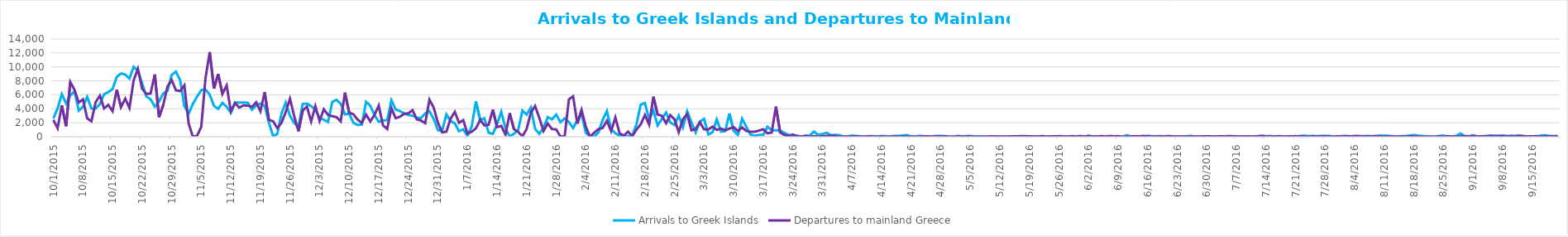
| Category | Arrivals to Greek Islands | Departures to mainland Greece |
|---|---|---|
| 10/1/15 | 2631 | 2409 |
| 10/2/15 | 4055 | 1215 |
| 10/3/15 | 6097 | 4480 |
| 10/4/15 | 4763 | 1513 |
| 10/5/15 | 5909 | 7833 |
| 10/6/15 | 6496 | 6707 |
| 10/7/15 | 3734 | 4886 |
| 10/8/15 | 4295 | 5349 |
| 10/9/15 | 5695 | 2631 |
| 10/10/15 | 4045 | 2214 |
| 10/11/15 | 4034 | 4950 |
| 10/12/15 | 4671 | 5879 |
| 10/13/15 | 6079 | 4052 |
| 10/14/15 | 6380 | 4564 |
| 10/15/15 | 6830 | 3660 |
| 10/16/15 | 8564 | 6743 |
| 10/17/15 | 9063 | 4239 |
| 10/18/15 | 8900 | 5457 |
| 10/19/15 | 8337 | 4119 |
| 10/20/15 | 10006 | 8083 |
| 10/21/15 | 9444 | 9725 |
| 10/22/15 | 7651 | 6896 |
| 10/23/15 | 5762 | 6120 |
| 10/24/15 | 5354 | 6195 |
| 10/25/15 | 4311 | 8916 |
| 10/26/15 | 5049 | 2804 |
| 10/27/15 | 6195 | 4540 |
| 10/28/15 | 6557 | 7191 |
| 10/29/15 | 8847 | 8117 |
| 10/30/15 | 9323 | 6649 |
| 10/31/15 | 8089 | 6537 |
| 11/1/15 | 4400 | 7360 |
| 11/2/15 | 3290 | 1935 |
| 11/3/15 | 4689 | 0 |
| 11/4/15 | 5740 | 142 |
| 11/5/15 | 6679 | 1430 |
| 11/6/15 | 6765 | 8392 |
| 11/7/15 | 6022 | 12116 |
| 11/8/15 | 4425 | 6902 |
| 11/9/15 | 3979 | 8977 |
| 11/10/15 | 4842 | 6133 |
| 11/11/15 | 4296 | 7354 |
| 11/12/15 | 3425 | 3650 |
| 11/13/15 | 4909 | 4820 |
| 11/14/15 | 4884 | 4171 |
| 11/15/15 | 4891 | 4497 |
| 11/16/15 | 4873 | 4442 |
| 11/17/15 | 3873 | 4289 |
| 11/18/15 | 4499 | 4927 |
| 11/19/15 | 4737 | 3644 |
| 11/20/15 | 4432 | 6389 |
| 11/21/15 | 2020 | 2401 |
| 11/22/15 | 76 | 2214 |
| 11/23/15 | 409 | 1245 |
| 11/24/15 | 3383 | 2006 |
| 11/25/15 | 4889 | 3565 |
| 11/26/15 | 2973 | 5435 |
| 11/27/15 | 1961 | 2932 |
| 11/28/15 | 1420 | 778 |
| 11/29/15 | 4703 | 3736 |
| 11/30/15 | 4744 | 4318 |
| 12/1/15 | 4386 | 2181 |
| 12/2/15 | 3863 | 4384 |
| 12/3/15 | 2671 | 2255 |
| 12/4/15 | 2435 | 3934 |
| 12/5/15 | 2110 | 3115 |
| 12/6/15 | 4978 | 2943 |
| 12/7/15 | 5287 | 2810 |
| 12/8/15 | 4721 | 2189 |
| 12/9/15 | 3203 | 6316 |
| 12/10/15 | 3308 | 3456 |
| 12/11/15 | 1999 | 3219 |
| 12/12/15 | 1671 | 2453 |
| 12/13/15 | 1738 | 1976 |
| 12/14/15 | 5005 | 3175 |
| 12/15/15 | 4421 | 2191 |
| 12/16/15 | 3105 | 3137 |
| 12/17/15 | 2135 | 4461 |
| 12/18/15 | 2330 | 1638 |
| 12/19/15 | 2373 | 1110 |
| 12/20/15 | 5223 | 4070 |
| 12/21/15 | 3904 | 2652 |
| 12/22/15 | 3668 | 2864 |
| 12/23/15 | 3354 | 3278 |
| 12/24/15 | 3110 | 3349 |
| 12/25/15 | 3008 | 3806 |
| 12/26/15 | 2710 | 2498 |
| 12/27/15 | 2678 | 2311 |
| 12/28/15 | 3337 | 1946 |
| 12/29/15 | 3643 | 5309 |
| 12/30/15 | 2552 | 4178 |
| 12/31/15 | 948 | 2009 |
| 1/1/16 | 828 | 623 |
| 1/2/16 | 3203 | 720 |
| 1/3/16 | 2241 | 2569 |
| 1/4/16 | 1917 | 3563 |
| 1/5/16 | 779 | 1998 |
| 1/6/16 | 1067 | 2377 |
| 1/7/16 | 119 | 463 |
| 1/8/16 | 1475 | 716 |
| 1/9/16 | 5050 | 1203 |
| 1/10/16 | 2410 | 2417 |
| 1/11/16 | 2645 | 1621 |
| 1/12/16 | 571 | 1701 |
| 1/13/16 | 408 | 3861 |
| 1/14/16 | 1792 | 1378 |
| 1/15/16 | 3564 | 1551 |
| 1/16/16 | 1188 | 301 |
| 1/17/16 | 39 | 3378 |
| 1/18/16 | 435 | 1078 |
| 1/19/16 | 964 | 695 |
| 1/20/16 | 3748 | 50 |
| 1/21/16 | 3166 | 1108 |
| 1/22/16 | 4176 | 3451 |
| 1/23/16 | 1124 | 4397 |
| 1/24/16 | 418 | 2706 |
| 1/25/16 | 1295 | 819 |
| 1/26/16 | 2808 | 1887 |
| 1/27/16 | 2488 | 1098 |
| 1/28/16 | 3180 | 1046 |
| 1/29/16 | 2076 | 40 |
| 1/30/16 | 2623 | 53 |
| 1/31/16 | 2105 | 5342 |
| 2/1/16 | 1244 | 5783 |
| 2/2/16 | 2368 | 1878 |
| 2/3/16 | 3299 | 3829 |
| 2/4/16 | 565 | 1436 |
| 2/5/16 | 38 | 0 |
| 2/6/16 | 7 | 578 |
| 2/7/16 | 608 | 1097 |
| 2/8/16 | 2418 | 1259 |
| 2/9/16 | 3676 | 2283 |
| 2/10/16 | 1071 | 793 |
| 2/11/16 | 502 | 2756 |
| 2/12/16 | 123 | 496 |
| 2/13/16 | 186 | 161 |
| 2/14/16 | 51 | 724 |
| 2/15/16 | 181 | 65 |
| 2/16/16 | 1783 | 1024 |
| 2/17/16 | 4611 | 1772 |
| 2/18/16 | 4824 | 3118 |
| 2/19/16 | 2440 | 1731 |
| 2/20/16 | 3772 | 5738 |
| 2/21/16 | 1618 | 3180 |
| 2/22/16 | 2545 | 3002 |
| 2/23/16 | 3474 | 1927 |
| 2/24/16 | 2044 | 3086 |
| 2/25/16 | 1675 | 2468 |
| 2/26/16 | 3021 | 649 |
| 2/27/16 | 1355 | 2525 |
| 2/28/16 | 3651 | 3234 |
| 2/29/16 | 2072 | 920 |
| 3/1/16 | 609 | 1107 |
| 3/2/16 | 2162 | 2073 |
| 3/3/16 | 2569 | 1061 |
| 3/4/16 | 332 | 1035 |
| 3/5/16 | 630 | 1444 |
| 3/6/16 | 2480 | 980 |
| 3/7/16 | 728 | 1171 |
| 3/8/16 | 811 | 922 |
| 3/9/16 | 3340 | 1169 |
| 3/10/16 | 835 | 1381 |
| 3/11/16 | 232 | 810 |
| 3/12/16 | 2578 | 1326 |
| 3/13/16 | 1418 | 831 |
| 3/14/16 | 301 | 693 |
| 3/15/16 | 128 | 721 |
| 3/16/16 | 252 | 882 |
| 3/17/16 | 263 | 1068 |
| 3/18/16 | 1431 | 489 |
| 3/19/16 | 926 | 608 |
| 3/20/16 | 931 | 4314 |
| 3/21/16 | 880 | 616 |
| 3/22/16 | 539 | 254 |
| 3/23/16 | 269 | 95 |
| 3/24/16 | 83 | 316 |
| 3/25/16 | 177 | 22 |
| 3/26/16 | 5 | 25 |
| 3/27/16 | 144 | 113 |
| 3/28/16 | 161 | 0 |
| 3/29/16 | 741 | 76 |
| 3/30/16 | 267 | 11 |
| 3/31/16 | 401 | 68 |
| 4/1/16 | 555 | 102 |
| 4/2/16 | 231 | 132 |
| 4/3/16 | 262 | 105 |
| 4/4/16 | 228 | 0 |
| 4/5/16 | 28 | 31 |
| 4/6/16 | 70 | 7 |
| 4/7/16 | 157 | 32 |
| 4/8/16 | 116 | 17 |
| 4/9/16 | 59 | 14 |
| 4/10/16 | 0 | 16 |
| 4/11/16 | 75 | 64 |
| 4/12/16 | 101 | 5 |
| 4/13/16 | 30 | 10 |
| 4/14/16 | 106 | 36 |
| 4/15/16 | 79 | 0 |
| 4/16/16 | 55 | 0 |
| 4/17/16 | 107 | 34 |
| 4/18/16 | 107 | 9 |
| 4/19/16 | 178 | 39 |
| 4/20/16 | 233 | 7 |
| 4/21/16 | 49 | 7 |
| 4/22/16 | 34 | 16 |
| 4/23/16 | 137 | 0 |
| 4/24/16 | 52 | 51 |
| 4/25/16 | 0 | 54 |
| 4/26/16 | 62 | 17 |
| 4/27/16 | 108 | 52 |
| 4/28/16 | 110 | 16 |
| 4/29/16 | 90 | 56 |
| 4/30/16 | 0 | 4 |
| 5/1/16 | 0 | 0 |
| 5/2/16 | 123 | 25 |
| 5/3/16 | 53 | 34 |
| 5/4/16 | 87 | 41 |
| 5/5/16 | 123 | 37 |
| 5/6/16 | 14 | 1 |
| 5/7/16 | 48 | 0 |
| 5/8/16 | 37 | 0 |
| 5/9/16 | 42 | 5 |
| 5/10/16 | 63 | 46 |
| 5/11/16 | 73 | 40 |
| 5/12/16 | 11 | 39 |
| 5/13/16 | 6 | 31 |
| 5/14/16 | 8 | 22 |
| 5/15/16 | 47 | 75 |
| 5/16/16 | 16 | 51 |
| 5/17/16 | 24 | 88 |
| 5/18/16 | 98 | 64 |
| 5/19/16 | 14 | 62 |
| 5/20/16 | 35 | 39 |
| 5/21/16 | 76 | 31 |
| 5/22/16 | 50 | 93 |
| 5/23/16 | 6 | 27 |
| 5/24/16 | 0 | 48 |
| 5/25/16 | 1 | 70 |
| 5/26/16 | 104 | 60 |
| 5/27/16 | 68 | 31 |
| 5/28/16 | 2 | 31 |
| 5/29/16 | 97 | 62 |
| 5/30/16 | 14 | 35 |
| 5/31/16 | 125 | 57 |
| 6/1/16 | 7 | 36 |
| 6/2/16 | 173 | 57 |
| 6/3/16 | 15 | 29 |
| 6/4/16 | 20 | 28 |
| 6/5/16 | 0 | 99 |
| 6/6/16 | 18 | 34 |
| 6/7/16 | 56 | 105 |
| 6/8/16 | 8 | 65 |
| 6/9/16 | 0 | 80 |
| 6/10/16 | 5 | 6 |
| 6/11/16 | 205 | 9 |
| 6/12/16 | 67 | 42 |
| 6/13/16 | 37 | 56 |
| 6/14/16 | 0 | 55 |
| 6/15/16 | 0 | 111 |
| 6/16/16 | 141 | 47 |
| 6/17/16 | 72 | 33 |
| 6/18/16 | 52 | 20 |
| 6/19/16 | 103 | 16 |
| 6/20/16 | 44 | 31 |
| 6/21/16 | 1 | 104 |
| 6/22/16 | 72 | 40 |
| 6/23/16 | 70 | 29 |
| 6/24/16 | 13 | 35 |
| 6/25/16 | 24 | 18 |
| 6/26/16 | 134 | 44 |
| 6/27/16 | 55 | 23 |
| 6/28/16 | 0 | 28 |
| 6/29/16 | 35 | 71 |
| 6/30/16 | 62 | 73 |
| 7/1/16 | 1 | 52 |
| 7/2/16 | 44 | 19 |
| 7/3/16 | 42 | 69 |
| 7/4/16 | 35 | 40 |
| 7/5/16 | 94 | 74 |
| 7/6/16 | 0 | 76 |
| 7/7/16 | 0 | 43 |
| 7/8/16 | 59 | 41 |
| 7/9/16 | 0 | 47 |
| 7/10/16 | 70 | 23 |
| 7/11/16 | 0 | 42 |
| 7/12/16 | 40 | 69 |
| 7/13/16 | 93 | 128 |
| 7/14/16 | 82 | 45 |
| 7/15/16 | 111 | 37 |
| 7/16/16 | 37 | 37 |
| 7/17/16 | 90 | 52 |
| 7/18/16 | 63 | 23 |
| 7/19/16 | 6 | 45 |
| 7/20/16 | 53 | 68 |
| 7/21/16 | 20 | 78 |
| 7/22/16 | 113 | 33 |
| 7/23/16 | 158 | 19 |
| 7/24/16 | 82 | 30 |
| 7/25/16 | 129 | 49 |
| 7/26/16 | 85 | 31 |
| 7/27/16 | 107 | 64 |
| 7/28/16 | 117 | 48 |
| 7/29/16 | 118 | 13 |
| 7/30/16 | 6 | 11 |
| 7/31/16 | 0 | 70 |
| 8/1/16 | 107 | 31 |
| 8/2/16 | 117 | 47 |
| 8/3/16 | 54 | 63 |
| 8/4/16 | 120 | 73 |
| 8/5/16 | 79 | 79 |
| 8/6/16 | 81 | 20 |
| 8/7/16 | 124 | 25 |
| 8/8/16 | 73 | 28 |
| 8/9/16 | 90 | 82 |
| 8/10/16 | 174 | 35 |
| 8/11/16 | 148 | 30 |
| 8/12/16 | 131 | 23 |
| 8/13/16 | 65 | 20 |
| 8/14/16 | 17 | 13 |
| 8/15/16 | 78 | 26 |
| 8/16/16 | 88 | 19 |
| 8/17/16 | 172 | 51 |
| 8/18/16 | 258 | 43 |
| 8/19/16 | 140 | 20 |
| 8/20/16 | 112 | 0 |
| 8/21/16 | 61 | 0 |
| 8/22/16 | 18 | 17 |
| 8/23/16 | 0 | 0 |
| 8/24/16 | 119 | 40 |
| 8/25/16 | 152 | 0 |
| 8/26/16 | 60 | 60 |
| 8/27/16 | 48 | 16 |
| 8/28/16 | 124 | 32 |
| 8/29/16 | 462 | 50 |
| 8/30/16 | 102 | 59 |
| 8/31/16 | 56 | 58 |
| 9/1/16 | 215 | 82 |
| 9/2/16 | 43 | 37 |
| 9/3/16 | 64 | 65 |
| 9/4/16 | 110 | 28 |
| 9/5/16 | 133 | 130 |
| 9/6/16 | 144 | 56 |
| 9/7/16 | 140 | 71 |
| 9/8/16 | 173 | 77 |
| 9/9/16 | 32 | 99 |
| 9/10/16 | 164 | 39 |
| 9/11/16 | 93 | 74 |
| 9/12/16 | 183 | 94 |
| 9/13/16 | 79 | 73 |
| 9/14/16 | 21 | 38 |
| 9/15/16 | 64 | 69 |
| 9/16/16 | 10 | 59 |
| 9/17/16 | 164 | 0 |
| 9/18/16 | 210 | 61 |
| 9/19/16 | 113 | 34 |
| 9/20/16 | 100 | 71 |
| 9/21/16 | 107 | 67 |